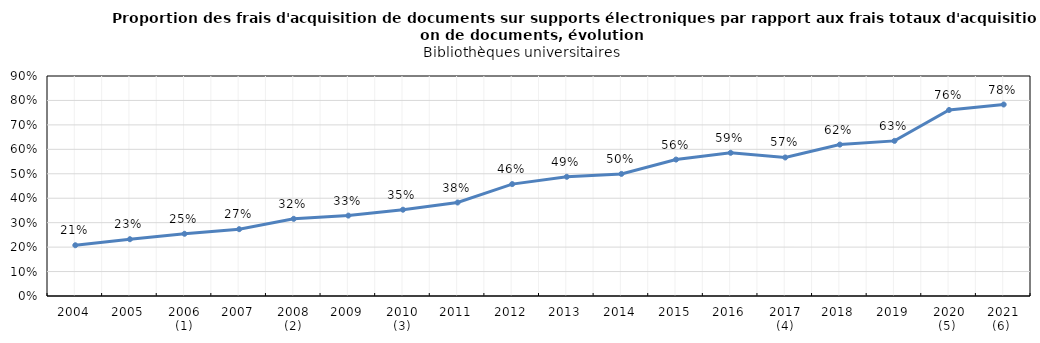
| Category | Series 0 |
|---|---|
| 2004 | 0.208 |
| 2005 | 0.232 |
| 2006 (1) | 0.255 |
| 2007 | 0.273 |
| 2008 (2) | 0.316 |
| 2009 | 0.329 |
| 2010 (3) | 0.353 |
| 2011 | 0.382 |
| 2012 | 0.458 |
| 2013 | 0.488 |
| 2014 | 0.499 |
| 2015 | 0.558 |
| 2016 | 0.586 |
| 2017 (4) | 0.567 |
| 2018 | 0.619 |
| 2019 | 0.635 |
| 2020 (5)  | 0.761 |
| 2021 (6)  | 0.783 |